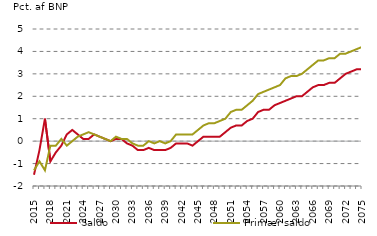
| Category | nul-linje | Saldo | Primær saldo |
|---|---|---|---|
| 2015.0 | 0 | -1.5 | -1.3 |
| 2016.0 | 0 | -0.4 | -0.9 |
| 2017.0 | 0 | 1 | -1.3 |
| 2018.0 | 0 | -0.9 | -0.2 |
| 2019.0 | 0 | -0.5 | -0.2 |
| 2020.0 | 0 | -0.2 | 0.1 |
| 2021.0 | 0 | 0.3 | -0.2 |
| 2022.0 | 0 | 0.5 | 0 |
| 2023.0 | 0 | 0.3 | 0.2 |
| 2024.0 | 0 | 0.1 | 0.3 |
| 2025.0 | 0 | 0.1 | 0.4 |
| 2026.0 | 0 | 0.3 | 0.3 |
| 2027.0 | 0 | 0.2 | 0.2 |
| 2028.0 | 0 | 0.1 | 0.1 |
| 2029.0 | 0 | 0 | 0 |
| 2030.0 | 0 | 0.1 | 0.2 |
| 2031.0 | 0 | 0.1 | 0.1 |
| 2032.0 | 0 | -0.1 | 0.1 |
| 2033.0 | 0 | -0.2 | -0.1 |
| 2034.0 | 0 | -0.4 | -0.2 |
| 2035.0 | 0 | -0.4 | -0.2 |
| 2036.0 | 0 | -0.3 | 0 |
| 2037.0 | 0 | -0.4 | -0.1 |
| 2038.0 | 0 | -0.4 | 0 |
| 2039.0 | 0 | -0.4 | -0.1 |
| 2040.0 | 0 | -0.3 | 0 |
| 2041.0 | 0 | -0.1 | 0.3 |
| 2042.0 | 0 | -0.1 | 0.3 |
| 2043.0 | 0 | -0.1 | 0.3 |
| 2044.0 | 0 | -0.2 | 0.3 |
| 2045.0 | 0 | 0 | 0.5 |
| 2046.0 | 0 | 0.2 | 0.7 |
| 2047.0 | 0 | 0.2 | 0.8 |
| 2048.0 | 0 | 0.2 | 0.8 |
| 2049.0 | 0 | 0.2 | 0.9 |
| 2050.0 | 0 | 0.4 | 1 |
| 2051.0 | 0 | 0.6 | 1.3 |
| 2052.0 | 0 | 0.7 | 1.4 |
| 2053.0 | 0 | 0.7 | 1.4 |
| 2054.0 | 0 | 0.9 | 1.6 |
| 2055.0 | 0 | 1 | 1.8 |
| 2056.0 | 0 | 1.3 | 2.1 |
| 2057.0 | 0 | 1.4 | 2.2 |
| 2058.0 | 0 | 1.4 | 2.3 |
| 2059.0 | 0 | 1.6 | 2.4 |
| 2060.0 | 0 | 1.7 | 2.5 |
| 2061.0 | 0 | 1.8 | 2.8 |
| 2062.0 | 0 | 1.9 | 2.9 |
| 2063.0 | 0 | 2 | 2.9 |
| 2064.0 | 0 | 2 | 3 |
| 2065.0 | 0 | 2.2 | 3.2 |
| 2066.0 | 0 | 2.4 | 3.4 |
| 2067.0 | 0 | 2.5 | 3.6 |
| 2068.0 | 0 | 2.5 | 3.6 |
| 2069.0 | 0 | 2.6 | 3.7 |
| 2070.0 | 0 | 2.6 | 3.7 |
| 2071.0 | 0 | 2.8 | 3.9 |
| 2072.0 | 0 | 3 | 3.9 |
| 2073.0 | 0 | 3.1 | 4 |
| 2074.0 | 0 | 3.2 | 4.1 |
| 2075.0 | 0 | 3.2 | 4.2 |